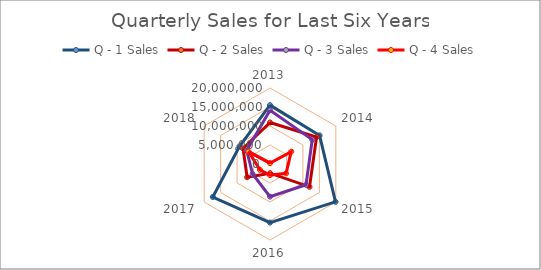
| Category | Q - 1 Sales | Q - 2 Sales | Q - 3 Sales | Q - 4 Sales |
|---|---|---|---|---|
| 2013.0 | 15489510.639 | 10930959.94 | 14120051.56 | 232599.43 |
| 2014.0 | 15060947.261 | 14147585.23 | 12829330.87 | 6435349.3 |
| 2015.0 | 19899937.07 | 12006025.37 | 10942732.26 | 4893708.71 |
| 2016.0 | 15426147.86 | 2413548.87 | 8588270.07 | 2926127.36 |
| 2017.0 | 17376463.75 | 6954400.84 | 5281969.42 | 3052677.485 |
| 2018.0 | 9265712.75 | 8189278.18 | 7083311.03 | 6551136.26 |